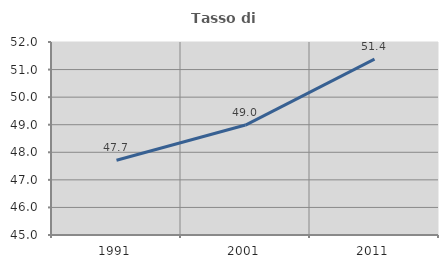
| Category | Tasso di occupazione   |
|---|---|
| 1991.0 | 47.712 |
| 2001.0 | 48.988 |
| 2011.0 | 51.382 |